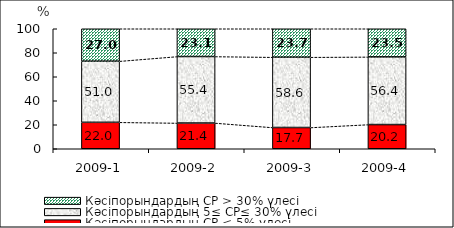
| Category | Кәсіпорындардың СР < 5% үлесі | Кәсіпорындардың 5≤ СР≤ 30% үлесі | Кәсіпорындардың СР > 30% үлесі |
|---|---|---|---|
| 2009-1 | 22.038 | 50.961 | 27.001 |
| 2009-2 | 21.436 | 55.434 | 23.131 |
| 2009-3 | 17.709 | 58.579 | 23.712 |
| 2009-4 | 20.166 | 56.376 | 23.457 |